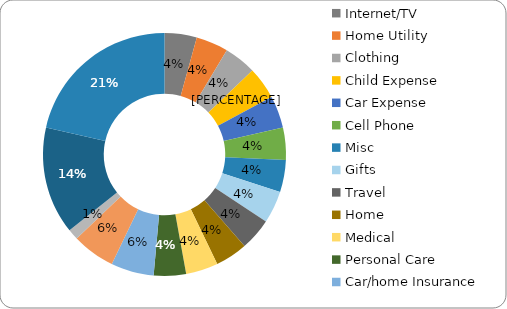
| Category | Series 0 |
|---|---|
| Internet/TV | 3 |
| Home Utility | 3 |
| Clothing | 3 |
| Child Expense | 3 |
| Car Expense | 3 |
| Cell Phone | 3 |
| Misc | 3 |
| Gifts | 3 |
| Travel | 3 |
| Home | 3 |
| Medical | 3 |
| Personal Care | 3 |
| Car/home Insurance | 4 |
| Auto Gas | 4 |
| Childcare | 1 |
| Grocery | 10 |
| Entertainment / Eating Out | 15 |